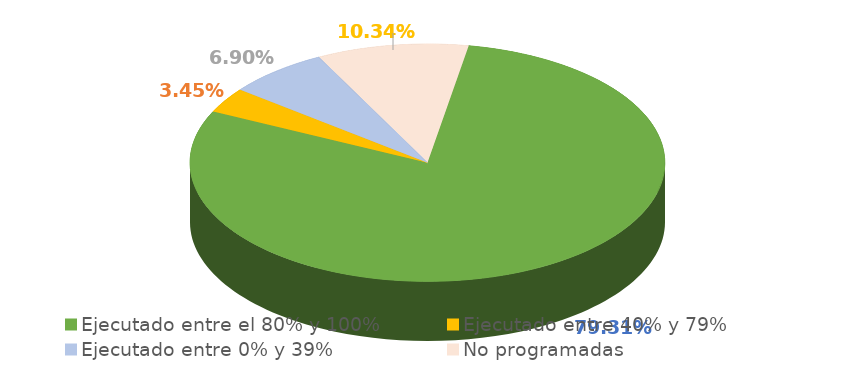
| Category | Series 0 |
|---|---|
| Ejecutado entre el 80% y 100% | 0.793 |
| Ejecutado entre 40% y 79% | 0.034 |
| Ejecutado entre 0% y 39% | 0.069 |
| No programadas | 0.103 |